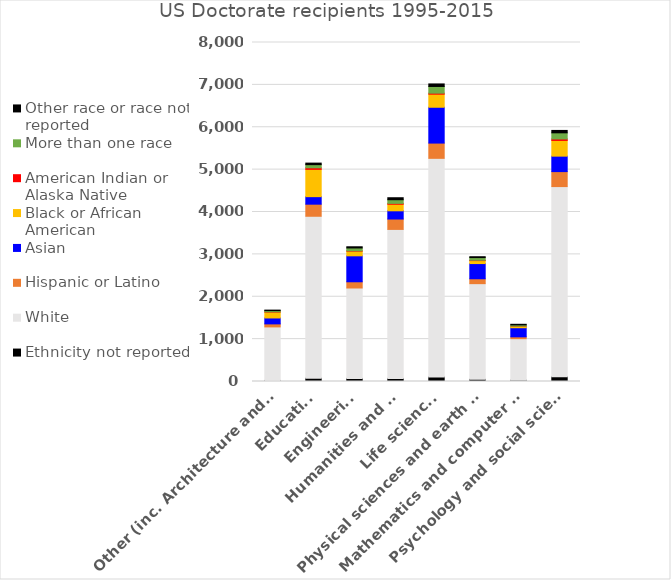
| Category | Ethnicity not reported | White | Hispanic or Latino | Asian | Black or African American | American Indian or Alaska Native | More than one race | Other race or race not reported |
|---|---|---|---|---|---|---|---|---|
| Other (inc. Architecture and Business) | 24.8 | 1263.6 | 71.2 | 139.8 | 138.4 | 6.2 | 29 | 11.6 |
| Education | 77.4 | 3822 | 285.2 | 177.4 | 644.2 | 36.6 | 74.667 | 36.4 |
| Engineering | 72.8 | 2133.8 | 146.8 | 612.6 | 109.8 | 7.8 | 68 | 27.8 |
| Humanities and arts | 73 | 3516.2 | 245 | 194 | 155 | 20 | 86.667 | 46.8 |
| Life sciences | 106.2 | 5160.4 | 359.8 | 845.4 | 308.8 | 23.4 | 158.333 | 60 |
| Physical sciences and earth sciences | 51.6 | 2257.6 | 115.4 | 358.4 | 70 | 8.8 | 62.333 | 20.6 |
| Mathematics and computer sciences | 31.4 | 979 | 43.8 | 215 | 37.4 | 2.4 | 27.333 | 13.6 |
| Psychology and social sciences  | 109.8 | 4490 | 353.6 | 364.6 | 370.6 | 34.8 | 145 | 56.6 |